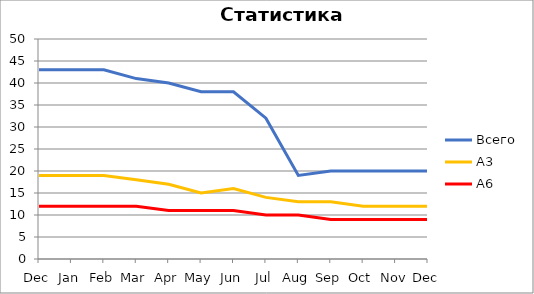
| Category | Всего | А3 | A6 |
|---|---|---|---|
| Dec | 43 | 19 | 12 |
| Jan | 43 | 19 | 12 |
| Feb | 43 | 19 | 12 |
| Mar | 41 | 18 | 12 |
| Apr | 40 | 17 | 11 |
| May | 38 | 15 | 11 |
| Jun | 38 | 16 | 11 |
| Jul | 32 | 14 | 10 |
| Aug | 19 | 13 | 10 |
| Sep | 20 | 13 | 9 |
| Oct | 20 | 12 | 9 |
| Nov | 20 | 12 | 9 |
| Dec | 20 | 12 | 9 |